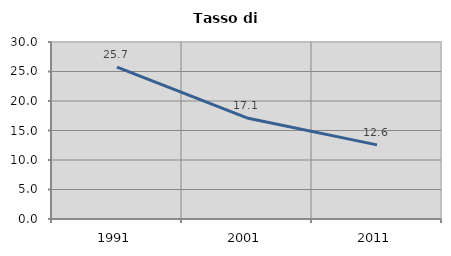
| Category | Tasso di disoccupazione   |
|---|---|
| 1991.0 | 25.729 |
| 2001.0 | 17.123 |
| 2011.0 | 12.56 |